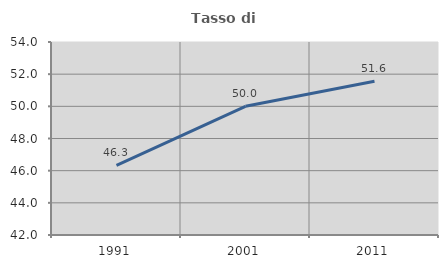
| Category | Tasso di occupazione   |
|---|---|
| 1991.0 | 46.324 |
| 2001.0 | 50 |
| 2011.0 | 51.558 |